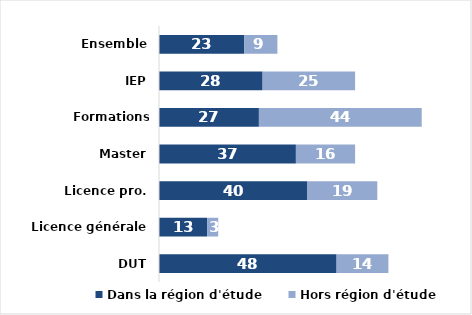
| Category | Dans la région d'étude | Hors région d'étude |
|---|---|---|
| DUT | 48 | 14 |
| Licence générale | 13 | 3 |
| Licence pro. | 40 | 19 |
| Master | 37 | 16 |
| Formations d'ingénieurs | 27 | 44 |
| IEP | 28 | 25 |
| Ensemble | 23 | 9 |